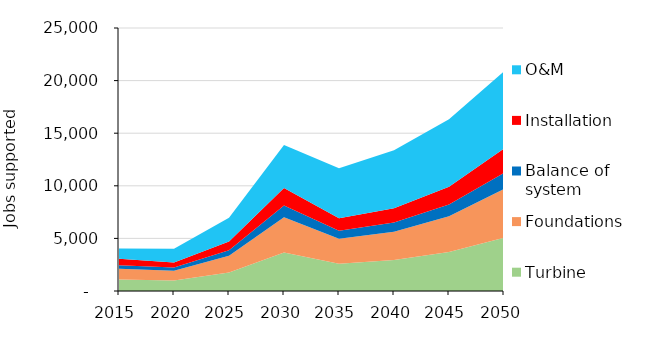
| Category | Turbine | Foundations | Balance of system | Installation | O&M  |
|---|---|---|---|---|---|
| 2015.0 | 1102.038 | 1007.941 | 332.793 | 618.125 | 990.809 |
| 2020.0 | 1004.863 | 919.063 | 303.448 | 489.46 | 1297.485 |
| 2025.0 | 1751.643 | 1602.079 | 528.96 | 824.383 | 2260.987 |
| 2030.0 | 3662.467 | 3349.748 | 1105.989 | 1676.939 | 4079.402 |
| 2035.0 | 2588.351 | 2367.345 | 781.629 | 1185.132 | 4750.144 |
| 2040.0 | 2942.601 | 2691.348 | 888.605 | 1347.333 | 5510.76 |
| 2045.0 | 3707.846 | 3391.252 | 1119.693 | 1697.717 | 6403.117 |
| 2050.0 | 5065.241 | 4632.746 | 1529.598 | 2319.23 | 7326.528 |